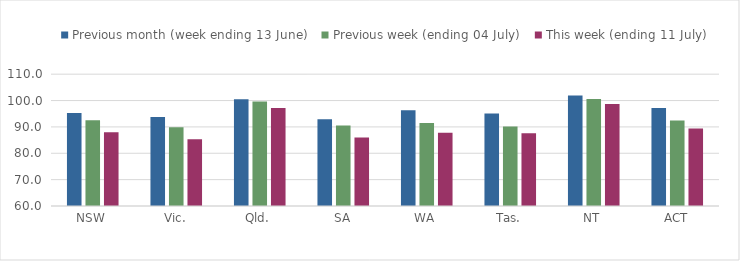
| Category | Previous month (week ending 13 June) | Previous week (ending 04 July) | This week (ending 11 July) |
|---|---|---|---|
| NSW | 95.296 | 92.483 | 87.937 |
| Vic. | 93.756 | 89.856 | 85.339 |
| Qld. | 100.448 | 99.643 | 97.187 |
| SA | 92.923 | 90.5 | 86.014 |
| WA | 96.315 | 91.468 | 87.745 |
| Tas. | 95.115 | 90.133 | 87.548 |
| NT | 101.883 | 100.554 | 98.724 |
| ACT | 97.156 | 92.417 | 89.431 |